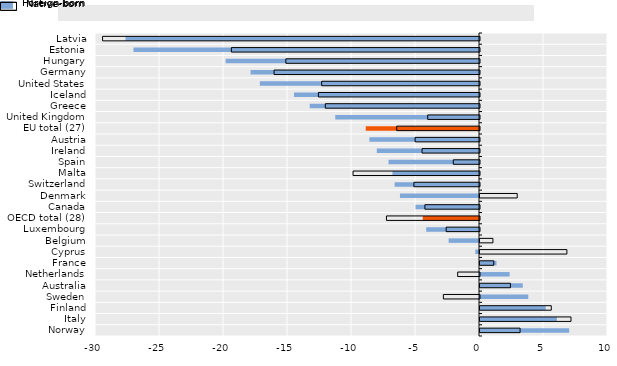
| Category | Foreign-born | Native-born |
|---|---|---|
| Latvia | -27.615 | -29.448 |
| Estonia | -26.997 | -19.385 |
| Hungary | -19.795 | -15.129 |
| Germany | -17.848 | -16.051 |
| United States | -17.12 | -12.33 |
| Iceland | -14.454 | -12.586 |
| Greece | -13.227 | -12.045 |
| United Kingdom | -11.231 | -4.047 |
| EU total (27) | -8.849 | -6.467 |
| Austria | -8.562 | -5.029 |
| Ireland | -7.985 | -4.49 |
| Spain | -7.066 | -2.047 |
| Malta | -6.764 | -9.879 |
| Switzerland | -6.59 | -5.126 |
| Denmark | -6.175 | 2.908 |
| Canada | -4.958 | -4.267 |
| OECD total (28) | -4.394 | -7.27 |
| Luxembourg | -4.127 | -2.605 |
| Belgium | -2.372 | 1.009 |
| Cyprus | -0.287 | 6.787 |
| France | 1.29 | 1.074 |
| Netherlands | 2.315 | -1.705 |
| Australia | 3.339 | 2.378 |
| Sweden | 3.772 | -2.822 |
| Finland | 5.135 | 5.57 |
| Italy | 6.004 | 7.108 |
| Norway | 6.967 | 3.132 |